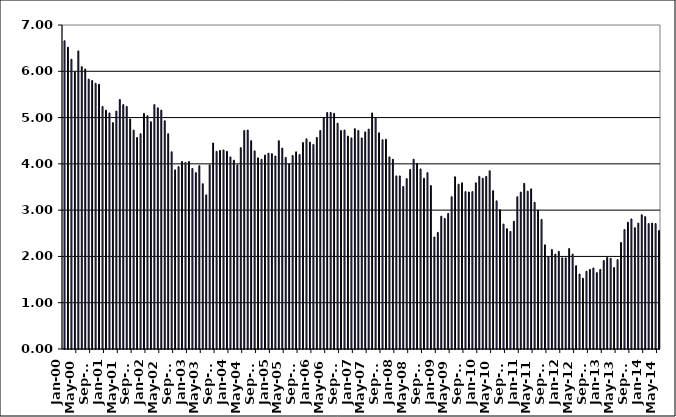
| Category | Series 0 |
|---|---|
| 2000-01-01 | 6.66 |
| 2000-02-01 | 6.52 |
| 2000-03-01 | 6.26 |
| 2000-04-01 | 5.99 |
| 2000-05-01 | 6.44 |
| 2000-06-01 | 6.1 |
| 2000-07-01 | 6.05 |
| 2000-08-01 | 5.83 |
| 2000-09-01 | 5.8 |
| 2000-10-01 | 5.74 |
| 2000-11-01 | 5.72 |
| 2000-12-01 | 5.24 |
| 2001-01-01 | 5.16 |
| 2001-02-01 | 5.1 |
| 2001-03-01 | 4.89 |
| 2001-04-01 | 5.14 |
| 2001-05-01 | 5.39 |
| 2001-06-01 | 5.28 |
| 2001-07-01 | 5.24 |
| 2001-08-01 | 4.97 |
| 2001-09-01 | 4.73 |
| 2001-10-01 | 4.57 |
| 2001-11-01 | 4.65 |
| 2001-12-01 | 5.09 |
| 2002-01-01 | 5.04 |
| 2002-02-01 | 4.91 |
| 2002-03-01 | 5.28 |
| 2002-04-01 | 5.21 |
| 2002-05-01 | 5.16 |
| 2002-06-01 | 4.93 |
| 2002-07-01 | 4.65 |
| 2002-08-01 | 4.26 |
| 2002-09-01 | 3.87 |
| 2002-10-01 | 3.94 |
| 2002-11-01 | 4.05 |
| 2002-12-01 | 4.03 |
| 2003-01-01 | 4.05 |
| 2003-02-01 | 3.9 |
| 2003-03-01 | 3.81 |
| 2003-04-01 | 3.96 |
| 2003-05-01 | 3.57 |
| 2003-06-01 | 3.33 |
| 2003-07-01 | 3.98 |
| 2003-08-01 | 4.45 |
| 2003-09-01 | 4.27 |
| 2003-10-01 | 4.29 |
| 2003-11-01 | 4.3 |
| 2003-12-01 | 4.27 |
| 2004-01-01 | 4.15 |
| 2004-02-01 | 4.08 |
| 2004-03-01 | 3.98 |
| 2004-04-01 | 4.35 |
| 2004-05-01 | 4.72 |
| 2004-06-01 | 4.73 |
| 2004-07-01 | 4.5 |
| 2004-08-01 | 4.28 |
| 2004-09-01 | 4.13 |
| 2004-10-01 | 4.1 |
| 2004-11-01 | 4.19 |
| 2004-12-01 | 4.23 |
| 2005-01-01 | 4.22 |
| 2005-02-01 | 4.17 |
| 2005-03-01 | 4.5 |
| 2005-04-01 | 4.34 |
| 2005-05-01 | 4.14 |
| 2005-06-01 | 4 |
| 2005-07-01 | 4.18 |
| 2005-08-01 | 4.26 |
| 2005-09-01 | 4.2 |
| 2005-10-01 | 4.46 |
| 2005-11-01 | 4.54 |
| 2005-12-01 | 4.47 |
| 2006-01-01 | 4.42 |
| 2006-02-01 | 4.57 |
| 2006-03-01 | 4.72 |
| 2006-04-01 | 4.99 |
| 2006-05-01 | 5.11 |
| 2006-06-01 | 5.11 |
| 2006-07-01 | 5.09 |
| 2006-08-01 | 4.88 |
| 2006-09-01 | 4.72 |
| 2006-10-01 | 4.73 |
| 2006-11-01 | 4.6 |
| 2006-12-01 | 4.56 |
| 2007-01-01 | 4.76 |
| 2007-02-01 | 4.72 |
| 2007-03-01 | 4.56 |
| 2007-04-01 | 4.69 |
| 2007-05-01 | 4.75 |
| 2007-06-01 | 5.1 |
| 2007-07-01 | 5 |
| 2007-08-01 | 4.67 |
| 2007-09-01 | 4.52 |
| 2007-10-01 | 4.53 |
| 2007-11-01 | 4.15 |
| 2007-12-01 | 4.1 |
| 2008-01-01 | 3.74 |
| 2008-02-01 | 3.74 |
| 2008-03-01 | 3.51 |
| 2008-04-01 | 3.68 |
| 2008-05-01 | 3.88 |
| 2008-06-01 | 4.1 |
| 2008-07-01 | 4.01 |
| 2008-08-01 | 3.89 |
| 2008-09-01 | 3.69 |
| 2008-10-01 | 3.81 |
| 2008-11-01 | 3.53 |
| 2008-12-01 | 2.42 |
| 2009-01-01 | 2.52 |
| 2009-02-01 | 2.87 |
| 2009-03-01 | 2.82 |
| 2009-04-01 | 2.93 |
| 2009-05-01 | 3.29 |
| 2009-06-01 | 3.72 |
| 2009-07-01 | 3.56 |
| 2009-08-01 | 3.59 |
| 2009-09-01 | 3.4 |
| 2009-10-01 | 3.39 |
| 2009-11-01 | 3.4 |
| 2009-12-01 | 3.59 |
| 2010-01-01 | 3.73 |
| 2010-02-01 | 3.69 |
| 2010-03-01 | 3.73 |
| 2010-04-01 | 3.85 |
| 2010-05-01 | 3.42 |
| 2010-06-01 | 3.2 |
| 2010-07-01 | 3.01 |
| 2010-08-01 | 2.7 |
| 2010-09-01 | 2.6 |
| 2010-10-01 | 2.54 |
| 2010-11-01 | 2.76 |
| 2010-12-01 | 3.29 |
| 2011-01-01 | 3.39 |
| 2011-02-01 | 3.58 |
| 2011-03-01 | 3.41 |
| 2011-04-01 | 3.46 |
| 2011-05-01 | 3.17 |
| 2011-06-01 | 3 |
| 2011-07-01 | 2.8 |
| 2011-08-01 | 2.25 |
| 2011-09-01 | 2 |
| 2011-10-01 | 2.15 |
| 2011-11-01 | 2.05 |
| 2011-12-01 | 2.11 |
| 2012-01-01 | 1.97 |
| 2012-02-01 | 1.97 |
| 2012-03-01 | 2.17 |
| 2012-04-01 | 2.05 |
| 2012-05-01 | 1.8 |
| 2012-06-01 | 1.62 |
| 2012-07-01 | 1.53 |
| 2012-08-01 | 1.68 |
| 2012-09-01 | 1.72 |
| 2012-10-01 | 1.75 |
| 2012-11-01 | 1.65 |
| 2012-12-01 | 1.72 |
| 2013-01-01 | 1.91 |
| 2013-02-01 | 1.98 |
| 2013-03-01 | 1.96 |
| 2013-04-01 | 1.76 |
| 2013-05-01 | 1.93 |
| 2013-06-01 | 2.3 |
| 2013-07-01 | 2.58 |
| 2013-08-01 | 2.74 |
| 2013-09-01 | 2.81 |
| 2013-10-01 | 2.62 |
| 2013-11-01 | 2.72 |
| 2013-12-01 | 2.9 |
| 2014-01-01 | 2.86 |
| 2014-02-01 | 2.71 |
| 2014-03-01 | 2.72 |
| 2014-04-01 | 2.71 |
| 2014-05-01 | 2.56 |